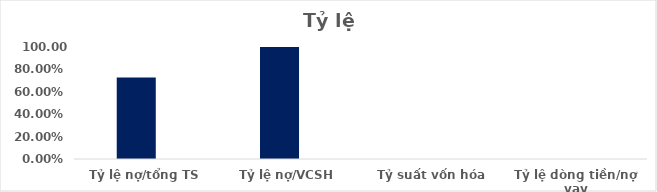
| Category | Series 0 | Series 1 | Series 2 | Series 3 | Series 4 | Series 5 | Series 6 |
|---|---|---|---|---|---|---|---|
| Tỷ lệ nợ/tổng TS | 0.727 |  |  |  |  |  |  |
| Tỷ lệ nợ/VCSH | 2.66 |  |  |  |  |  |  |
| Tỷ suất vốn hóa | 0 |  |  |  |  |  |  |
| Tỷ lệ dòng tiền/nợ vay | 0 |  |  |  |  |  |  |